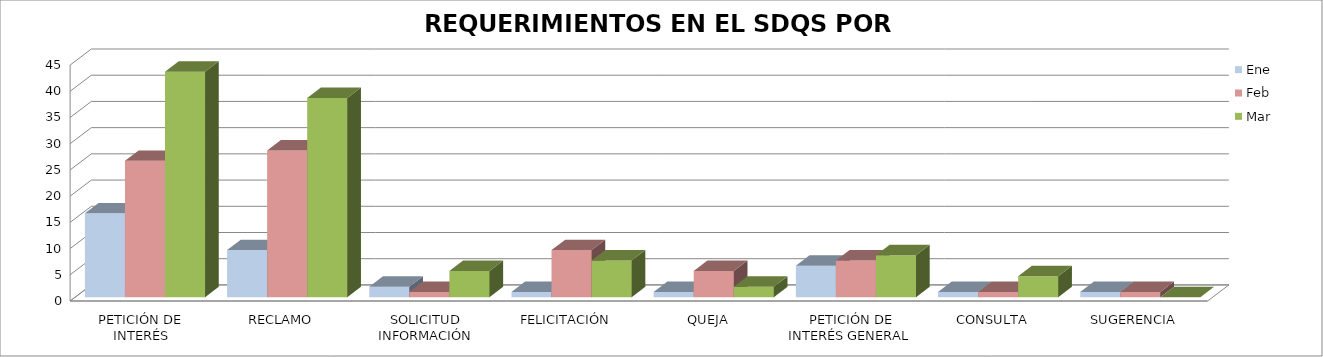
| Category | Ene | Feb | Mar |
|---|---|---|---|
| PETICIÓN DE INTERÉS PARTICULAR | 16 | 26 | 43 |
| RECLAMO | 9 | 28 | 38 |
| SOLICITUD INFORMACIÓN | 2 | 1 | 5 |
| FELICITACIÓN | 1 | 9 | 7 |
| QUEJA | 1 | 5 | 2 |
| PETICIÓN DE INTERÉS GENERAL  | 6 | 7 | 8 |
| CONSULTA | 1 | 1 | 4 |
| SUGERENCIA | 1 | 1 | 0 |